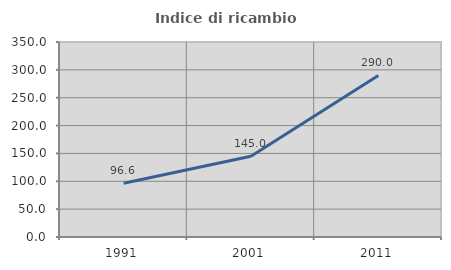
| Category | Indice di ricambio occupazionale  |
|---|---|
| 1991.0 | 96.602 |
| 2001.0 | 145.027 |
| 2011.0 | 290.044 |